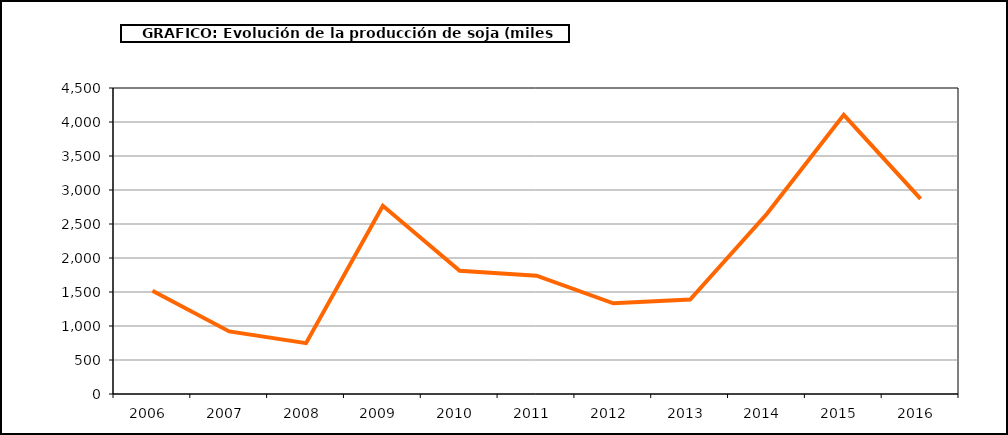
| Category | Producción |
|---|---|
| 2006.0 | 1519 |
| 2007.0 | 920 |
| 2008.0 | 748 |
| 2009.0 | 2767 |
| 2010.0 | 1812 |
| 2011.0 | 1740 |
| 2012.0 | 1333 |
| 2013.0 | 1390 |
| 2014.0 | 2650 |
| 2015.0 | 4106 |
| 2016.0 | 2869 |